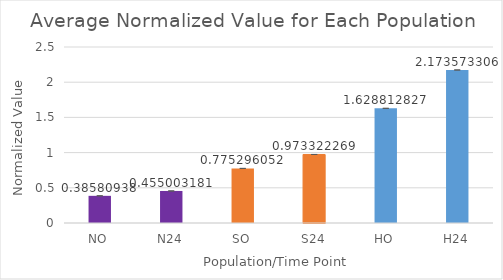
| Category | Series 0 |
|---|---|
| NO | 0.386 |
| N24 | 0.455 |
| SO | 0.775 |
| S24 | 0.973 |
| HO | 1.629 |
| H24 | 2.174 |